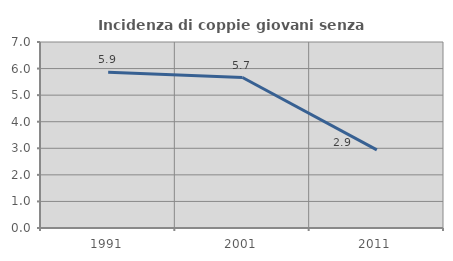
| Category | Incidenza di coppie giovani senza figli |
|---|---|
| 1991.0 | 5.857 |
| 2001.0 | 5.664 |
| 2011.0 | 2.941 |